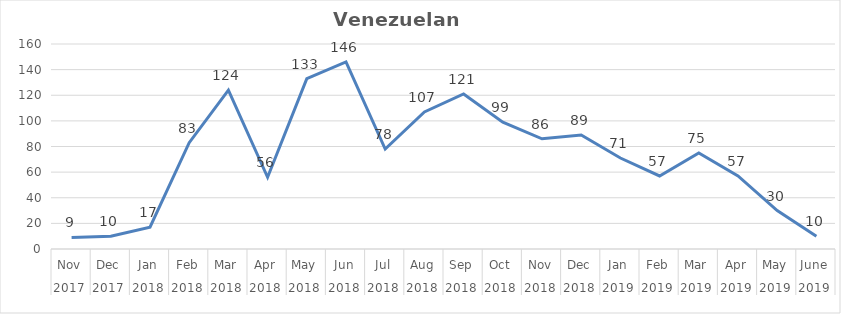
| Category | Series 0 |
|---|---|
| 0 | 9 |
| 1 | 10 |
| 2 | 17 |
| 3 | 83 |
| 4 | 124 |
| 5 | 56 |
| 6 | 133 |
| 7 | 146 |
| 8 | 78 |
| 9 | 107 |
| 10 | 121 |
| 11 | 99 |
| 12 | 86 |
| 13 | 89 |
| 14 | 71 |
| 15 | 57 |
| 16 | 75 |
| 17 | 57 |
| 18 | 30 |
| 19 | 10 |